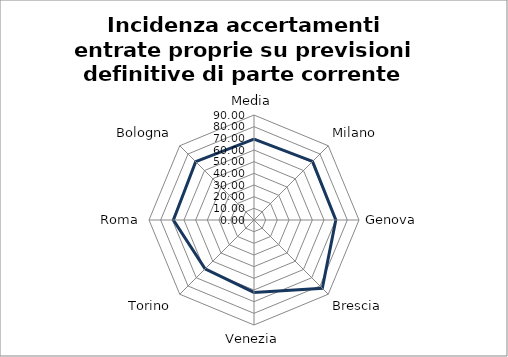
| Category | Incidenza accertamenti entrate proprie su previsioni definitive di parte corrente |
|---|---|
| Media | 69.289 |
| Milano | 70.95 |
| Genova | 70.13 |
| Brescia | 82.8 |
| Venezia | 62.1 |
| Torino | 59.3 |
| Roma | 69.06 |
| Bologna | 70.68 |